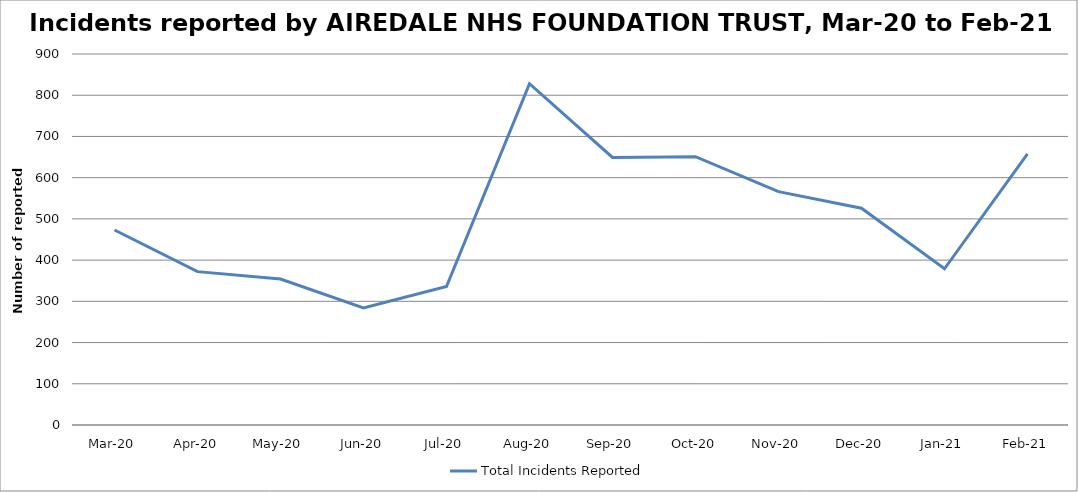
| Category | Total Incidents Reported |
|---|---|
| Mar-20 | 473 |
| Apr-20 | 372 |
| May-20 | 354 |
| Jun-20 | 284 |
| Jul-20 | 336 |
| Aug-20 | 828 |
| Sep-20 | 649 |
| Oct-20 | 651 |
| Nov-20 | 566 |
| Dec-20 | 526 |
| Jan-21 | 379 |
| Feb-21 | 658 |